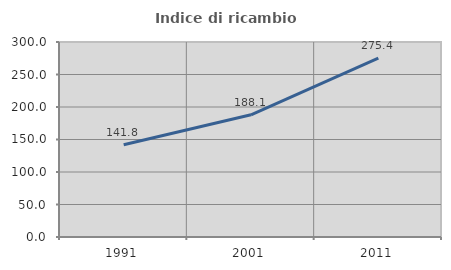
| Category | Indice di ricambio occupazionale  |
|---|---|
| 1991.0 | 141.808 |
| 2001.0 | 188.05 |
| 2011.0 | 275.362 |